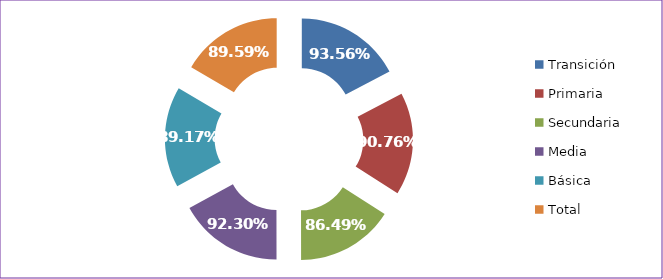
| Category | Tasa Aprobación |
|---|---|
| Transición | 0.936 |
| Primaria | 0.908 |
| Secundaria | 0.865 |
| Media | 0.923 |
| Básica | 0.892 |
| Total | 0.896 |